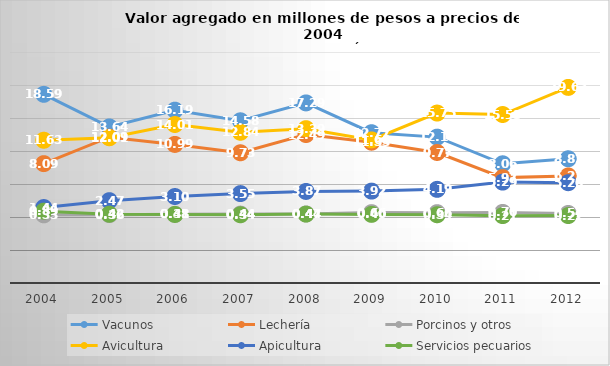
| Category | Vacunos | Lechería | Porcinos y otros | Avicultura | Apicultura | Servicios pecuarios |
|---|---|---|---|---|---|---|
| 2004.0 | 18.585 | 8.085 | 0.326 | 11.629 | 1.436 | 0.889 |
| 2005.0 | 13.643 | 12.088 | 0.36 | 12.01 | 2.473 | 0.422 |
| 2006.0 | 16.186 | 10.995 | 0.408 | 14.012 | 3.103 | 0.384 |
| 2007.0 | 14.578 | 9.733 | 0.444 | 12.838 | 3.547 | 0.34 |
| 2008.0 | 17.285 | 12.494 | 0.465 | 13.385 | 3.869 | 0.436 |
| 2009.0 | 12.77 | 11.334 | 0.664 | 11.68 | 3.923 | 0.395 |
| 2010.0 | 12.103 | 9.773 | 0.661 | 15.75 | 4.192 | 0.341 |
| 2011.0 | 8.063 | 5.966 | 0.698 | 15.527 | 5.286 | 0.208 |
| 2012.0 | 8.824 | 6.22 | 0.539 | 19.635 | 5.198 | 0.217 |